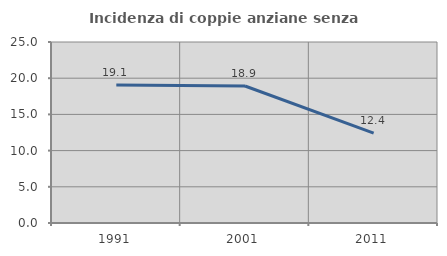
| Category | Incidenza di coppie anziane senza figli  |
|---|---|
| 1991.0 | 19.075 |
| 2001.0 | 18.919 |
| 2011.0 | 12.403 |